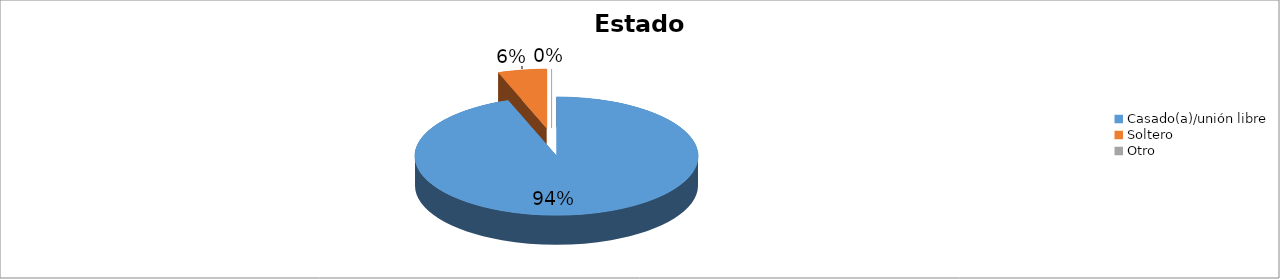
| Category | Series 0 |
|---|---|
| Casado(a)/unión libre | 0.944 |
| Soltero | 0.056 |
| Otro | 0 |